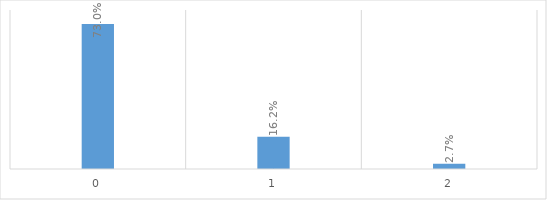
| Category | Series 0 |
|---|---|
| 0.0 | 0.73 |
| 1.0 | 0.162 |
| 2.0 | 0.027 |